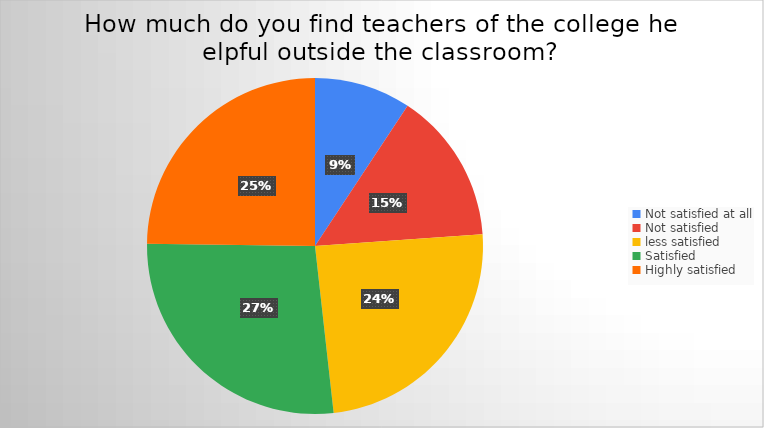
| Category | Series 0 |
|---|---|
| Not satisfied at all | 21 |
| Not satisfied  | 33 |
| less satisfied | 55 |
| Satisfied | 61 |
| Highly satisfied | 56 |